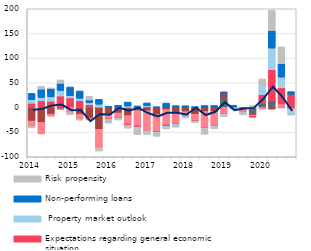
| Category | Other factors | Costs of funding | Competition from other banks | Expectations regarding general economic situation |  Property market outlook | Non-performing loans  | Risk propensity |
|---|---|---|---|---|---|---|---|
| 2014.0 | 0.064 | -27.614 | -10.883 | 8.513 | 7.366 | 12.572 | -2.931 |
| nan | 0 | -30.154 | -23.565 | 13.381 | 6.958 | 16.79 | 5.591 |
| nan | 0 | -13.58 | -4.04 | 12.84 | 8.698 | 16.68 | 1.322 |
| nan | 0 | -3.194 | -0.943 | 23.215 | 11.346 | 14.413 | 6.815 |
| 2015.0 | 0 | 1.584 | -10.634 | 17.798 | 4.391 | 17.665 | -4.309 |
| nan | 0 | -13.709 | -9.748 | 14.011 | 4.433 | 14.906 | -2.291 |
| nan | 0 | -21.32 | -4.036 | 5.521 | 4.364 | 5.262 | 7.435 |
| nan | 0 | -44.371 | -37.787 | 0.672 | 5.886 | 9.984 | -6.068 |
| 2016.0 | 0 | -13.683 | -9.865 | -0.183 | -2.017 | 2.537 | -5.896 |
| nan | 0 | -11.339 | -9.602 | -0.197 | -1.974 | 4.34 | -2.332 |
| nan | 0 | -16.54 | -16.708 | -2.652 | 2.885 | 8.061 | -6.073 |
| nan | 0 | -6.439 | -30.804 | -2.596 | -1.957 | 3.101 | -13.396 |
| 2017.0 | 1.137 | -6.563 | -40.484 | -0.096 | 2.394 | 5.669 | -7.434 |
| nan | 0 | -14.708 | -34.121 | -1.211 | -2.234 | 1.309 | -6.144 |
| nan | 0 | -4.365 | -31.359 | -2.483 | -2.033 | 8.902 | -3.307 |
| nan | 0 | -9.63 | -23.589 | -0.294 | -2.083 | 3.686 | -4.267 |
| 2018.0 | 0 | -8.401 | -9.465 | -0.308 | -2.087 | 3.545 | -0.758 |
| nan | 0 | -13.817 | -13.719 | -0.384 | -1.143 | 1.627 | -1.188 |
| nan | 0 | -8.391 | -32.723 | -0.405 | -2.001 | 3.96 | -10.656 |
| nan | 0 | -8.386 | -28.581 | -0.415 | -2.043 | 4.097 | -3.682 |
| 2019.0 | 19.953 | 7.614 | -12.529 | -0.41 | -2.062 | 4.174 | -3.764 |
| nan | 0 | -0.003 | 0 | -0.494 | 0 | 4.55 | -3.594 |
| nan | 0 | -3.529 | -4.583 | -0.546 | 0 | 0 | -6.275 |
| nan | -12.056 | -3.387 | -3.387 | -0.556 | 0 | 0 | 3.746 |
| 2020.0 | 8.2 | 0 | -3.3 | 17.776 | 18.324 | 0 | 13.5 |
| nan | 13.5 | -3.3 | 0 | 63.053 | 43.711 | 35.524 | 40.8 |
| nan | -0.7 | 0 | 7.2 | 32.599 | 21.695 | 27.071 | 34.2 |
| nan | -0.411 | -0.778 | -3.063 | 26.746 | -8.12 | 5.298 | -3.047 |